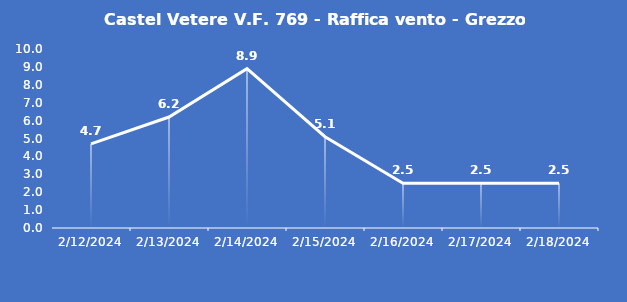
| Category | Castel Vetere V.F. 769 - Raffica vento - Grezzo (m/s) |
|---|---|
| 2/12/24 | 4.7 |
| 2/13/24 | 6.2 |
| 2/14/24 | 8.9 |
| 2/15/24 | 5.1 |
| 2/16/24 | 2.5 |
| 2/17/24 | 2.5 |
| 2/18/24 | 2.5 |